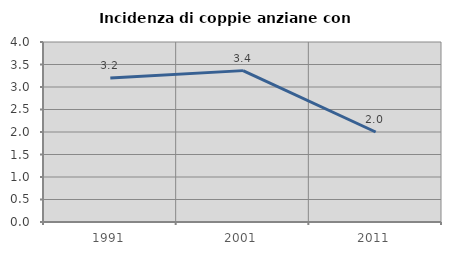
| Category | Incidenza di coppie anziane con figli |
|---|---|
| 1991.0 | 3.198 |
| 2001.0 | 3.364 |
| 2011.0 | 2 |